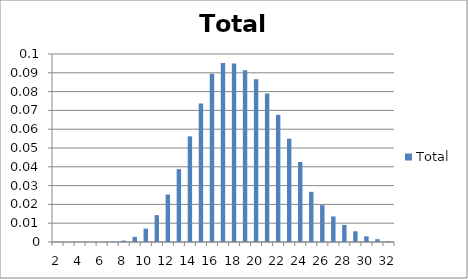
| Category | Total |
|---|---|
| 2 | 0 |
| 3 | 0 |
| 4 | 0 |
| 5 | 0 |
| 6 | 0 |
| 7 | 0 |
| 8 | 0.001 |
| 9 | 0.003 |
| 10 | 0.007 |
| 11 | 0.014 |
| 12 | 0.025 |
| 13 | 0.039 |
| 14 | 0.056 |
| 15 | 0.074 |
| 16 | 0.089 |
| 17 | 0.095 |
| 18 | 0.095 |
| 19 | 0.091 |
| 20 | 0.087 |
| 21 | 0.079 |
| 22 | 0.068 |
| 23 | 0.055 |
| 24 | 0.043 |
| 25 | 0.027 |
| 26 | 0.02 |
| 27 | 0.014 |
| 28 | 0.009 |
| 29 | 0.006 |
| 30 | 0.003 |
| 31 | 0.002 |
| 32 | 0 |